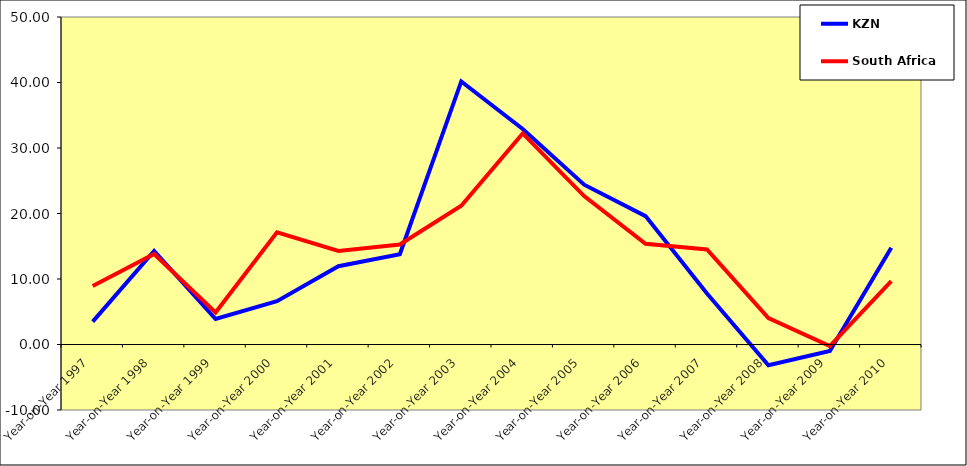
| Category | KZN | South Africa |
|---|---|---|
| Year-on-Year 1997 | 3.499 | 8.936 |
| Year-on-Year 1998 | 14.274 | 13.809 |
| Year-on-Year 1999 | 3.89 | 4.9 |
| Year-on-Year 2000 | 6.622 | 17.118 |
| Year-on-Year 2001 | 11.954 | 14.28 |
| Year-on-Year 2002 | 13.789 | 15.27 |
| Year-on-Year 2003 | 40.167 | 21.177 |
| Year-on-Year 2004 | 32.906 | 32.234 |
| Year-on-Year 2005 | 24.395 | 22.667 |
| Year-on-Year 2006 | 19.602 | 15.385 |
| Year-on-Year 2007 | 7.797 | 14.515 |
| Year-on-Year 2008 | -3.165 | 4.035 |
| Year-on-Year 2009 | -0.999 | -0.249 |
| Year-on-Year 2010 | 14.769 | 9.692 |